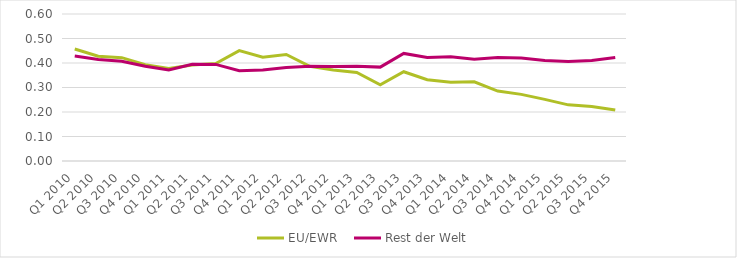
| Category | EU/EWR | Rest der Welt |
|---|---|---|
| Q1 2010 | 0.457 | 0.429 |
| Q2 2010 | 0.427 | 0.415 |
| Q3 2010 | 0.422 | 0.407 |
| Q4 2010 | 0.393 | 0.386 |
| Q1 2011 | 0.378 | 0.372 |
| Q2 2011 | 0.392 | 0.395 |
| Q3 2011 | 0.398 | 0.394 |
| Q4 2011 | 0.451 | 0.368 |
| Q1 2012 | 0.423 | 0.371 |
| Q2 2012 | 0.435 | 0.382 |
| Q3 2012 | 0.386 | 0.387 |
| Q4 2012 | 0.371 | 0.386 |
| Q1 2013 | 0.361 | 0.387 |
| Q2 2013 | 0.311 | 0.383 |
| Q3 2013 | 0.364 | 0.439 |
| Q4 2013 | 0.332 | 0.422 |
| Q1 2014 | 0.321 | 0.425 |
| Q2 2014 | 0.323 | 0.415 |
| Q3 2014 | 0.285 | 0.422 |
| Q4 2014 | 0.272 | 0.42 |
| Q1 2015 | 0.252 | 0.41 |
| Q2 2015 | 0.229 | 0.406 |
| Q3 2015 | 0.222 | 0.41 |
| Q4 2015 | 0.208 | 0.423 |